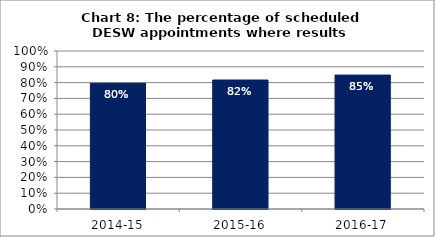
| Category | Chart 6: The percentage of scheduled DRSSW appointments whose results were reported |
|---|---|
| 2014-15 | 0.795 |
| 2015-16 | 0.816 |
| 2016-17 | 0.848 |